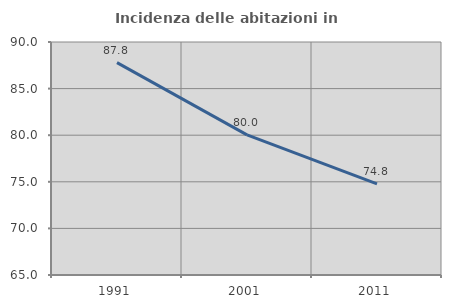
| Category | Incidenza delle abitazioni in proprietà  |
|---|---|
| 1991.0 | 87.786 |
| 2001.0 | 80.034 |
| 2011.0 | 74.778 |